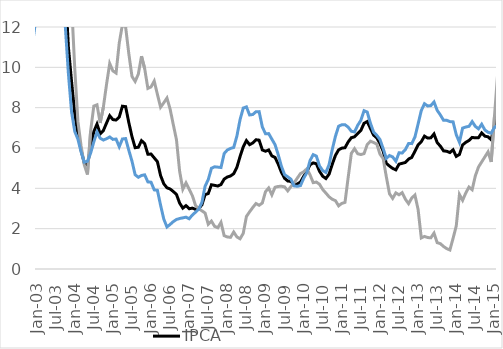
| Category | IPCA | Preços Administrados | Livres |
|---|---|---|---|
| 2000-07-01 | 7.056 | 12.271 | 5.373 |
| 2000-08-01 | 7.855 | 13.47 | 6.018 |
| 2000-09-01 | 7.769 | 12.825 | 6.11 |
| 2000-10-01 | 6.65 | 11.947 | 4.923 |
| 2000-11-01 | 5.985 | 11.075 | 4.305 |
| 2000-12-01 | 5.974 | 12.902 | 3.686 |
| 2001-01-01 | 5.922 | 13.23 | 3.51 |
| 2001-02-01 | 6.271 | 14.065 | 3.709 |
| 2001-03-01 | 6.44 | 12.71 | 4.352 |
| 2001-04-01 | 6.61 | 12.577 | 4.632 |
| 2001-05-01 | 7.036 | 12.754 | 5.135 |
| 2001-06-01 | 7.346 | 14.244 | 5.053 |
| 2001-07-01 | 7.05 | 13.332 | 4.89 |
| 2001-08-01 | 6.406 | 11.481 | 4.63 |
| 2001-09-01 | 6.459 | 12.004 | 4.525 |
| 2001-10-01 | 7.192 | 13.338 | 5.055 |
| 2001-11-01 | 7.609 | 12.754 | 5.801 |
| 2001-12-01 | 7.673 | 10.759 | 6.564 |
| 2002-01-01 | 7.62 | 10.241 | 6.674 |
| 2002-02-01 | 7.513 | 9.192 | 6.905 |
| 2002-03-01 | 7.748 | 10.488 | 6.763 |
| 2002-04-01 | 7.984 | 12.949 | 6.214 |
| 2002-05-01 | 7.769 | 12.816 | 5.969 |
| 2002-06-01 | 7.662 | 12.404 | 5.948 |
| 2002-07-01 | 7.513 | 11.493 | 6.035 |
| 2002-08-01 | 7.459 | 10.604 | 6.287 |
| 2002-09-01 | 7.931 | 10.036 | 7.145 |
| 2002-10-01 | 8.445 | 10.06 | 7.839 |
| 2002-11-01 | 10.932 | 14.16 | 9.724 |
| 2002-12-01 | 12.53 | 15.316 | 11.489 |
| 2003-01-01 | 14.467 | 19.301 | 12.664 |
| 2003-02-01 | 15.847 | 22.996 | 13.208 |
| 2003-03-01 | 16.573 | 22.837 | 14.241 |
| 2003-04-01 | 16.769 | 21.693 | 14.902 |
| 2003-05-01 | 17.235 | 22.309 | 15.309 |
| 2003-06-01 | 16.57 | 19.702 | 15.369 |
| 2003-07-01 | 15.429 | 17.567 | 14.595 |
| 2003-08-01 | 15.074 | 18.393 | 13.786 |
| 2003-09-01 | 15.142 | 20.182 | 13.209 |
| 2003-10-01 | 13.983 | 18.873 | 12.111 |
| 2003-11-01 | 11.018 | 14.391 | 9.704 |
| 2003-12-01 | 9.3 | 13.202 | 7.792 |
| 2004-01-01 | 7.707 | 9.946 | 6.823 |
| 2004-02-01 | 6.689 | 7.319 | 6.437 |
| 2004-03-01 | 5.888 | 6.1 | 5.803 |
| 2004-04-01 | 5.259 | 5.161 | 5.298 |
| 2004-05-01 | 5.154 | 4.686 | 5.343 |
| 2004-06-01 | 6.06 | 6.848 | 5.746 |
| 2004-07-01 | 6.812 | 8.077 | 6.304 |
| 2004-08-01 | 7.184 | 8.144 | 6.797 |
| 2004-09-01 | 6.706 | 7.243 | 6.487 |
| 2004-10-01 | 6.865 | 8.023 | 6.395 |
| 2004-11-01 | 7.238 | 9.155 | 6.459 |
| 2004-12-01 | 7.601 | 10.192 | 6.549 |
| 2005-01-01 | 7.408 | 9.823 | 6.427 |
| 2005-02-01 | 7.387 | 9.717 | 6.445 |
| 2005-03-01 | 7.537 | 11.209 | 6.063 |
| 2005-04-01 | 8.072 | 12.12 | 6.449 |
| 2005-05-01 | 8.051 | 12.009 | 6.467 |
| 2005-06-01 | 7.268 | 10.689 | 5.893 |
| 2005-07-01 | 6.566 | 9.552 | 5.35 |
| 2005-08-01 | 6.016 | 9.302 | 4.673 |
| 2005-09-01 | 6.037 | 9.664 | 4.549 |
| 2005-10-01 | 6.364 | 10.551 | 4.638 |
| 2005-11-01 | 6.216 | 9.932 | 4.669 |
| 2005-12-01 | 5.69 | 8.955 | 4.319 |
| 2006-01-01 | 5.7 | 9.03 | 4.305 |
| 2006-02-01 | 5.511 | 9.32 | 3.923 |
| 2006-03-01 | 5.322 | 8.661 | 3.901 |
| 2006-04-01 | 4.633 | 8.022 | 3.165 |
| 2006-05-01 | 4.227 | 8.242 | 2.478 |
| 2006-06-01 | 4.029 | 8.479 | 2.083 |
| 2006-07-01 | 3.967 | 7.929 | 2.211 |
| 2006-08-01 | 3.842 | 7.159 | 2.35 |
| 2006-09-01 | 3.697 | 6.407 | 2.455 |
| 2006-10-01 | 3.265 | 4.836 | 2.505 |
| 2006-11-01 | 3.019 | 3.955 | 2.536 |
| 2006-12-01 | 3.142 | 4.272 | 2.571 |
| 2007-01-01 | 2.988 | 3.95 | 2.491 |
| 2007-02-01 | 3.019 | 3.633 | 2.677 |
| 2007-03-01 | 2.957 | 3.149 | 2.817 |
| 2007-04-01 | 2.998 | 2.993 | 2.965 |
| 2007-05-01 | 3.184 | 2.884 | 3.303 |
| 2007-06-01 | 3.69 | 2.777 | 4.104 |
| 2007-07-01 | 3.742 | 2.216 | 4.435 |
| 2007-08-01 | 4.177 | 2.373 | 4.996 |
| 2007-09-01 | 4.146 | 2.115 | 5.067 |
| 2007-10-01 | 4.115 | 2.045 | 5.051 |
| 2007-11-01 | 4.188 | 2.313 | 5.031 |
| 2007-12-01 | 4.457 | 1.653 | 5.726 |
| 2008-01-01 | 4.561 | 1.588 | 5.903 |
| 2008-02-01 | 4.613 | 1.57 | 5.98 |
| 2008-03-01 | 4.728 | 1.834 | 6.025 |
| 2008-04-01 | 5.041 | 1.59 | 6.591 |
| 2008-05-01 | 5.576 | 1.498 | 7.408 |
| 2008-06-01 | 6.06 | 1.767 | 7.98 |
| 2008-07-01 | 6.367 | 2.605 | 8.039 |
| 2008-08-01 | 6.166 | 2.837 | 7.638 |
| 2008-09-01 | 6.25 | 3.05 | 7.661 |
| 2008-10-01 | 6.409 | 3.247 | 7.798 |
| 2008-11-01 | 6.388 | 3.161 | 7.803 |
| 2008-12-01 | 5.902 | 3.272 | 7.046 |
| 2009-01-01 | 5.839 | 3.834 | 6.707 |
| 2009-02-01 | 5.902 | 4.017 | 6.714 |
| 2009-03-01 | 5.607 | 3.677 | 6.438 |
| 2009-04-01 | 5.534 | 4.053 | 6.167 |
| 2009-05-01 | 5.199 | 4.094 | 5.668 |
| 2009-06-01 | 4.802 | 4.103 | 5.096 |
| 2009-07-01 | 4.499 | 4.072 | 4.68 |
| 2009-08-01 | 4.364 | 3.876 | 4.57 |
| 2009-09-01 | 4.343 | 4.084 | 4.453 |
| 2009-10-01 | 4.167 | 4.276 | 4.121 |
| 2009-11-01 | 4.218 | 4.504 | 4.099 |
| 2009-12-01 | 4.312 | 4.733 | 4.135 |
| 2010-01-01 | 4.592 | 4.816 | 4.498 |
| 2010-02-01 | 4.832 | 4.967 | 4.775 |
| 2010-03-01 | 5.166 | 4.673 | 5.373 |
| 2010-04-01 | 5.261 | 4.281 | 5.672 |
| 2010-05-01 | 5.219 | 4.312 | 5.598 |
| 2010-06-01 | 4.841 | 4.2 | 5.109 |
| 2010-07-01 | 4.601 | 3.941 | 4.877 |
| 2010-08-01 | 4.486 | 3.764 | 4.788 |
| 2010-09-01 | 4.705 | 3.58 | 5.177 |
| 2010-10-01 | 5.195 | 3.457 | 5.927 |
| 2010-11-01 | 5.635 | 3.39 | 6.581 |
| 2010-12-01 | 5.909 | 3.132 | 7.081 |
| 2011-01-01 | 5.993 | 3.253 | 7.151 |
| 2011-02-01 | 6.014 | 3.302 | 7.154 |
| 2011-03-01 | 6.299 | 4.534 | 7.034 |
| 2011-04-01 | 6.51 | 5.734 | 6.832 |
| 2011-05-01 | 6.553 | 5.966 | 6.795 |
| 2011-06-01 | 6.713 | 5.715 | 7.125 |
| 2011-07-01 | 6.873 | 5.676 | 7.37 |
| 2011-08-01 | 7.225 | 5.722 | 7.85 |
| 2011-09-01 | 7.311 | 6.17 | 7.783 |
| 2011-10-01 | 6.97 | 6.337 | 7.23 |
| 2011-11-01 | 6.641 | 6.273 | 6.791 |
| 2011-12-01 | 6.503 | 6.197 | 6.627 |
| 2012-01-01 | 6.218 | 5.698 | 6.422 |
| 2012-02-01 | 5.849 | 5.482 | 5.975 |
| 2012-03-01 | 5.24 | 4.576 | 5.484 |
| 2012-04-01 | 5.104 | 3.732 | 5.626 |
| 2012-05-01 | 4.989 | 3.502 | 5.556 |
| 2012-06-01 | 4.916 | 3.775 | 5.345 |
| 2012-07-01 | 5.199 | 3.681 | 5.762 |
| 2012-08-01 | 5.241 | 3.784 | 5.753 |
| 2012-09-01 | 5.282 | 3.459 | 5.923 |
| 2012-10-01 | 5.45 | 3.24 | 6.221 |
| 2012-11-01 | 5.534 | 3.519 | 6.217 |
| 2012-12-01 | 5.839 | 3.668 | 6.543 |
| 2013-01-01 | 6.154 | 2.951 | 7.193 |
| 2013-02-01 | 6.313 | 1.54 | 7.856 |
| 2013-03-01 | 6.589 | 1.616 | 8.196 |
| 2013-04-01 | 6.493 | 1.56 | 8.085 |
| 2013-05-01 | 6.504 | 1.545 | 8.103 |
| 2013-06-01 | 6.696 | 1.779 | 8.282 |
| 2013-07-01 | 6.271 | 1.306 | 7.867 |
| 2013-08-01 | 6.091 | 1.259 | 7.639 |
| 2013-09-01 | 5.859 | 1.116 | 7.373 |
| 2013-10-01 | 5.838 | 1.01 | 7.373 |
| 2013-11-01 | 5.774 | 0.944 | 7.309 |
| 2013-12-01 | 5.911 | 1.522 | 7.297 |
| 2014-01-01 | 5.585 | 2.134 | 6.66 |
| 2014-02-01 | 5.68 | 3.696 | 6.284 |
| 2014-03-01 | 6.153 | 3.407 | 6.987 |
| 2014-04-01 | 6.28 | 3.772 | 7.04 |
| 2014-05-01 | 6.375 | 4.063 | 7.075 |
| 2014-06-01 | 6.524 | 3.932 | 7.31 |
| 2014-07-01 | 6.502 | 4.619 | 7.071 |
| 2014-08-01 | 6.513 | 5.058 | 6.952 |
| 2014-09-01 | 6.746 | 5.311 | 7.178 |
| 2014-10-01 | 6.587 | 5.558 | 6.895 |
| 2014-11-01 | 6.555 | 5.81 | 6.778 |
| 2014-12-01 | 6.408 | 5.307 | 6.737 |
| 2015-01-01 | 7.138 | 7.533 | 7.02 |
| 2015-02-01 | 7.702 | 9.641 | 7.126 |
| 2015-03-01 | 8.129 | 13.354 | 6.596 |
| 2015-04-01 | 8.172 | 13.364 | 6.647 |
| 2015-05-01 | 8.473 | 14.077 | 6.824 |
| 2015-06-01 | 8.894 | 15.065 | 7.082 |
| 2015-07-01 | 9.559 | 15.963 | 7.669 |
| 2015-08-01 | 9.526 | 15.751 | 7.683 |
| 2015-09-01 | 9.493 | 16.342 | 7.47 |
| 2015-10-01 | 9.929 | 17.51 | 7.691 |
| 2015-11-01 | 10.476 | 17.942 | 8.266 |
| 2015-12-01 | 10.673 | 18.059 | 8.497 |
| 2016-01-01 | 10.706 | 17.199 | 8.762 |
| 2016-02-01 | 10.356 | 14.931 | 8.966 |
| 2016-03-01 | 9.387 | 10.786 | 8.951 |
| 2016-04-01 | 9.278 | 10.688 | 8.838 |
| 2016-05-01 | 9.322 | 10.876 | 8.833 |
| 2016-06-01 | 8.844 | 9.91 | 8.508 |
| 2016-07-01 | 8.736 | 8.533 | 8.801 |
| 2016-08-01 | 8.975 | 8.466 | 9.137 |
| 2016-09-01 | 8.476 | 7.878 | 8.668 |
| 2016-10-01 | 7.874 | 6.978 | 8.163 |
| 2016-11-01 | 6.987 | 6.061 | 7.286 |
| 2016-12-01 | 6.288 | 5.495 | 6.542 |
| 2017-01-01 | 5.354 | 4.506 | 5.628 |
| 2017-02-01 | 4.759 | 4.706 | 4.776 |
| 2017-03-01 | 4.571 | 5.594 | 4.247 |
| 2017-04-01 | 4.083 | 4.244 | 4.031 |
| 2017-05-01 | 3.597 | 4.41 | 3.337 |
| 2017-06-01 | 2.998 | 3.303 | 2.901 |
| 2017-07-01 | 2.711 | 4.724 | 2.073 |
| 2017-08-01 | 2.456 | 6.261 | 1.252 |
| 2017-09-01 | 2.538 | 6.13 | 1.397 |
| 2017-10-01 | 2.701 | 6.592 | 1.462 |
| 2017-11-01 | 2.804 | 7.765 | 1.222 |
| 2017-12-01 | 2.947 | 8 | 1.343 |
| 2018-01-01 | 2.855 | 7.356 | 1.418 |
| 2018-02-01 | 2.845 | 7.326 | 1.409 |
| 2018-03-01 | 2.681 | 7.063 | 1.273 |
| 2018-04-01 | 2.763 | 8.358 | 0.983 |
| 2018-05-01 | 2.855 | 8.162 | 1.138 |
| 2018-06-01 | 4.391 | 11.781 | 2.019 |
| 2018-07-01 | 4.485 | 11.357 | 2.247 |
| 2018-08-01 | 4.193 | 9.595 | 2.397 |
| 2018-09-01 | 4.526 | 10.382 | 2.577 |
| 2018-10-01 | 4.557 | 9.908 | 2.763 |
| 2018-11-01 | 4.046 | 7.391 | 2.909 |
| 2018-12-01 | 3.745 | 6.217 | 2.908 |
| 2019-01-01 | 3.777 | 6.058 | 3.004 |
| 2019-02-01 | 3.89 | 5.776 | 3.25 |
| 2019-03-01 | 4.575 | 6.321 | 3.982 |
| 2019-04-01 | 4.941 | 6.77 | 4.315 |
| 2019-05-01 | 4.658 | 6.549 | 4.003 |
| 2019-06-01 | 3.366 | 3.757 | 3.229 |
| 2019-07-01 | 3.222 | 3.253 | 3.211 |
| 2019-08-01 | 3.429 | 3.739 | 3.318 |
| 2019-09-01 | 2.894 | 2.874 | 2.901 |
| 2019-10-01 | 2.535 | 2.201 | 2.655 |
| 2019-11-01 | 3.275 | 4.229 | 2.936 |
| 2019-12-01 | 4.306 | 5.528 | 3.878 |
| 2020-01-01 | 4.192 | 6.021 | 3.555 |
| 2020-02-01 | 4.005 | 5.427 | 3.51 |
| 2020-03-01 | 3.303 | 4.415 | 2.915 |
| 2020-04-01 | 2.399 | 1.225 | 2.801 |
| 2020-05-01 | 1.877 | -0.958 | 2.874 |
| 2020-06-01 | 2.132 | 0.122 | 2.835 |
| 2020-07-01 | 2.305 | 0.941 | 2.782 |